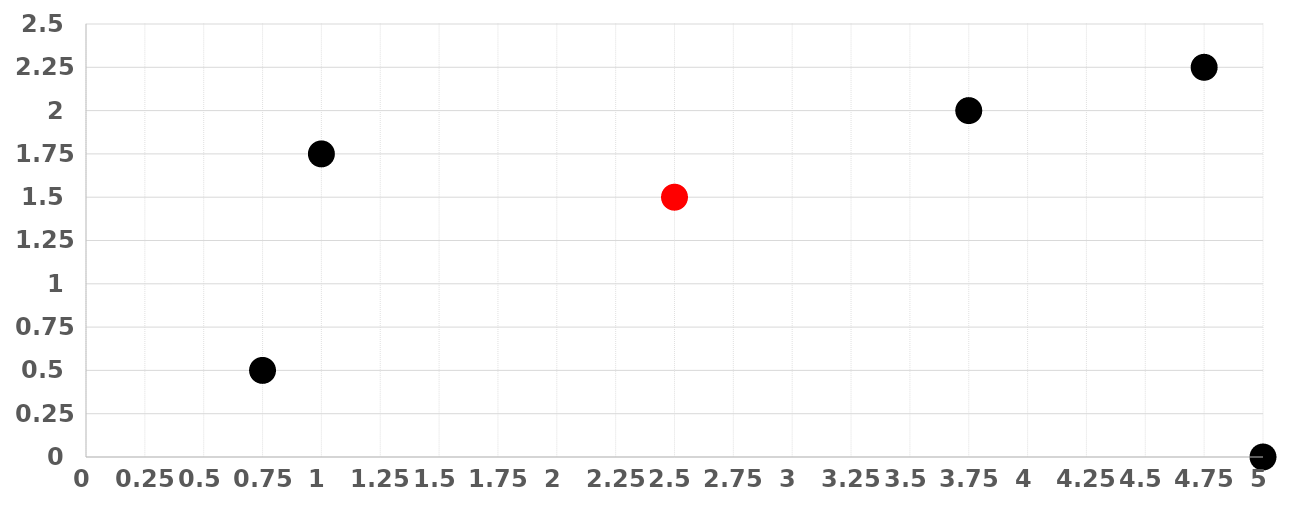
| Category | Y |
|---|---|
| 1.0 | 1.75 |
| 3.75 | 2 |
| 4.75 | 2.25 |
| 5.0 | 0 |
| 0.75 | 0.5 |
| 2.5 | 1.5 |